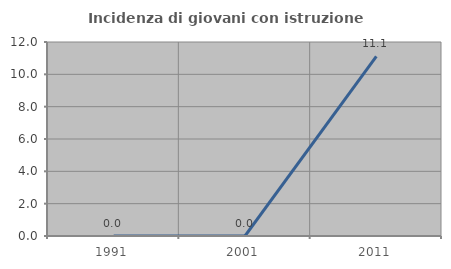
| Category | Incidenza di giovani con istruzione universitaria |
|---|---|
| 1991.0 | 0 |
| 2001.0 | 0 |
| 2011.0 | 11.111 |